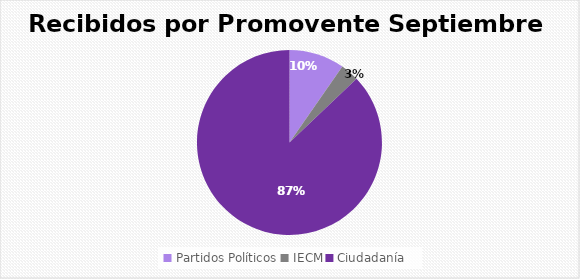
| Category | Recibidos por Promovente SEPTEIMBRE |
|---|---|
| Partidos Políticos | 3 |
| IECM | 1 |
| Ciudadanía  | 27 |